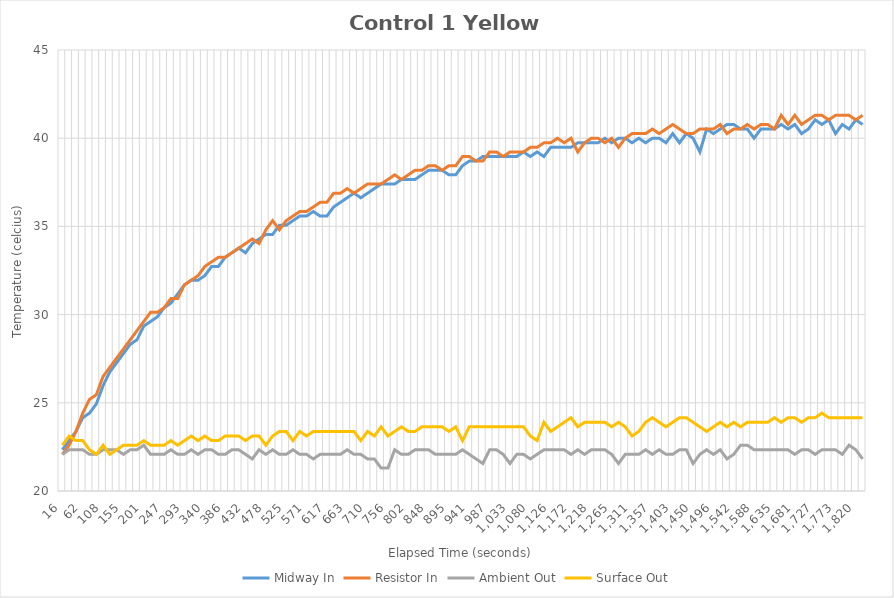
| Category | Midway In | Resistor In | Ambient Out | Surface Out |
|---|---|---|---|---|
| 15.82 | 22.338 | 22.078 | 22.078 | 22.597 |
| 31.24 | 22.857 | 22.597 | 22.338 | 23.117 |
| 46.66 | 23.377 | 23.377 | 22.338 | 22.857 |
| 62.08 | 24.156 | 24.416 | 22.338 | 22.857 |
| 77.5 | 24.416 | 25.195 | 22.078 | 22.338 |
| 92.92 | 24.935 | 25.454 | 22.078 | 22.078 |
| 108.34 | 25.974 | 26.494 | 22.338 | 22.597 |
| 123.76 | 26.753 | 27.013 | 22.338 | 22.078 |
| 139.18 | 27.273 | 27.532 | 22.338 | 22.338 |
| 154.6 | 27.792 | 28.052 | 22.078 | 22.597 |
| 170.02 | 28.312 | 28.571 | 22.338 | 22.597 |
| 185.44 | 28.571 | 29.091 | 22.338 | 22.597 |
| 200.86 | 29.351 | 29.61 | 22.597 | 22.857 |
| 216.28 | 29.61 | 30.13 | 22.078 | 22.597 |
| 231.7 | 29.87 | 30.13 | 22.078 | 22.597 |
| 247.12 | 30.39 | 30.39 | 22.078 | 22.597 |
| 262.54 | 30.649 | 30.909 | 22.338 | 22.857 |
| 277.96 | 31.169 | 30.909 | 22.078 | 22.597 |
| 293.38 | 31.688 | 31.688 | 22.078 | 22.857 |
| 308.8 | 31.948 | 31.948 | 22.338 | 23.117 |
| 324.22 | 31.948 | 32.208 | 22.078 | 22.857 |
| 339.64 | 32.208 | 32.727 | 22.338 | 23.117 |
| 355.05 | 32.727 | 32.987 | 22.338 | 22.857 |
| 370.46 | 32.727 | 33.247 | 22.078 | 22.857 |
| 385.88 | 33.247 | 33.247 | 22.078 | 23.117 |
| 401.3 | 33.506 | 33.506 | 22.338 | 23.117 |
| 416.71 | 33.766 | 33.766 | 22.338 | 23.117 |
| 432.13 | 33.506 | 34.026 | 22.078 | 22.857 |
| 447.55 | 34.026 | 34.286 | 21.818 | 23.117 |
| 462.97 | 34.286 | 34.026 | 22.338 | 23.117 |
| 478.39 | 34.546 | 34.805 | 22.078 | 22.597 |
| 493.8 | 34.546 | 35.325 | 22.338 | 23.117 |
| 509.22 | 35.065 | 34.805 | 22.078 | 23.377 |
| 524.64 | 35.065 | 35.325 | 22.078 | 23.377 |
| 540.06 | 35.325 | 35.584 | 22.338 | 22.857 |
| 555.48 | 35.584 | 35.844 | 22.078 | 23.377 |
| 570.9 | 35.584 | 35.844 | 22.078 | 23.117 |
| 586.32 | 35.844 | 36.104 | 21.818 | 23.377 |
| 601.74 | 35.584 | 36.364 | 22.078 | 23.377 |
| 617.16 | 35.584 | 36.364 | 22.078 | 23.377 |
| 632.58 | 36.104 | 36.883 | 22.078 | 23.377 |
| 648.0 | 36.364 | 36.883 | 22.078 | 23.377 |
| 663.42 | 36.623 | 37.143 | 22.338 | 23.377 |
| 678.84 | 36.883 | 36.883 | 22.078 | 23.377 |
| 694.25 | 36.623 | 37.143 | 22.078 | 22.857 |
| 709.67 | 36.883 | 37.403 | 21.818 | 23.377 |
| 725.08 | 37.143 | 37.403 | 21.818 | 23.117 |
| 740.5 | 37.403 | 37.403 | 21.299 | 23.636 |
| 755.91 | 37.403 | 37.662 | 21.299 | 23.117 |
| 771.33 | 37.403 | 37.922 | 22.338 | 23.377 |
| 786.75 | 37.662 | 37.662 | 22.078 | 23.636 |
| 802.17 | 37.662 | 37.922 | 22.078 | 23.377 |
| 817.58 | 37.662 | 38.182 | 22.338 | 23.377 |
| 833.0 | 37.922 | 38.182 | 22.338 | 23.636 |
| 848.42 | 38.182 | 38.442 | 22.338 | 23.636 |
| 863.84 | 38.182 | 38.442 | 22.078 | 23.636 |
| 879.26 | 38.182 | 38.182 | 22.078 | 23.636 |
| 894.67 | 37.922 | 38.442 | 22.078 | 23.377 |
| 910.09 | 37.922 | 38.442 | 22.078 | 23.636 |
| 925.5 | 38.442 | 38.961 | 22.338 | 22.857 |
| 940.91 | 38.701 | 38.961 | 22.078 | 23.636 |
| 956.32 | 38.701 | 38.701 | 21.818 | 23.636 |
| 971.74 | 38.961 | 38.701 | 21.558 | 23.636 |
| 987.16 | 38.961 | 39.221 | 22.338 | 23.636 |
| 1002.58 | 38.961 | 39.221 | 22.338 | 23.636 |
| 1017.99 | 38.961 | 38.961 | 22.078 | 23.636 |
| 1033.4 | 38.961 | 39.221 | 21.558 | 23.636 |
| 1048.81 | 38.961 | 39.221 | 22.078 | 23.636 |
| 1064.23 | 39.221 | 39.221 | 22.078 | 23.636 |
| 1079.65 | 38.961 | 39.48 | 21.818 | 23.117 |
| 1095.07 | 39.221 | 39.48 | 22.078 | 22.857 |
| 1110.48 | 38.961 | 39.74 | 22.338 | 23.896 |
| 1125.9 | 39.48 | 39.74 | 22.338 | 23.377 |
| 1141.32 | 39.48 | 40 | 22.338 | 23.636 |
| 1156.73 | 39.48 | 39.74 | 22.338 | 23.896 |
| 1172.14 | 39.48 | 40 | 22.078 | 24.156 |
| 1187.56 | 39.74 | 39.221 | 22.338 | 23.636 |
| 1202.98 | 39.74 | 39.74 | 22.078 | 23.896 |
| 1218.39 | 39.74 | 40 | 22.338 | 23.896 |
| 1233.81 | 39.74 | 40 | 22.338 | 23.896 |
| 1249.23 | 40 | 39.74 | 22.338 | 23.896 |
| 1264.65 | 39.74 | 40 | 22.078 | 23.636 |
| 1280.07 | 40 | 39.48 | 21.558 | 23.896 |
| 1295.49 | 40 | 40 | 22.078 | 23.636 |
| 1310.91 | 39.74 | 40.26 | 22.078 | 23.117 |
| 1326.33 | 40 | 40.26 | 22.078 | 23.377 |
| 1341.75 | 39.74 | 40.26 | 22.338 | 23.896 |
| 1357.17 | 40 | 40.52 | 22.078 | 24.156 |
| 1372.58 | 40 | 40.26 | 22.338 | 23.896 |
| 1387.99 | 39.74 | 40.52 | 22.078 | 23.636 |
| 1403.41 | 40.26 | 40.779 | 22.078 | 23.896 |
| 1418.83 | 39.74 | 40.52 | 22.338 | 24.156 |
| 1434.25 | 40.26 | 40.26 | 22.338 | 24.156 |
| 1449.66 | 40 | 40.26 | 21.558 | 23.896 |
| 1465.07 | 39.221 | 40.52 | 22.078 | 23.636 |
| 1480.49 | 40.52 | 40.52 | 22.338 | 23.377 |
| 1495.9 | 40.26 | 40.52 | 22.078 | 23.636 |
| 1511.32 | 40.52 | 40.779 | 22.338 | 23.896 |
| 1526.74 | 40.779 | 40.26 | 21.818 | 23.636 |
| 1542.16 | 40.779 | 40.52 | 22.078 | 23.896 |
| 1557.57 | 40.52 | 40.52 | 22.597 | 23.636 |
| 1572.98 | 40.52 | 40.779 | 22.597 | 23.896 |
| 1588.39 | 40 | 40.52 | 22.338 | 23.896 |
| 1603.79 | 40.52 | 40.779 | 22.338 | 23.896 |
| 1619.21 | 40.52 | 40.779 | 22.338 | 23.896 |
| 1634.63 | 40.52 | 40.52 | 22.338 | 24.156 |
| 1650.05 | 40.779 | 41.299 | 22.338 | 23.896 |
| 1665.47 | 40.52 | 40.779 | 22.338 | 24.156 |
| 1680.89 | 40.779 | 41.299 | 22.078 | 24.156 |
| 1696.3 | 40.26 | 40.779 | 22.338 | 23.896 |
| 1711.72 | 40.52 | 41.039 | 22.338 | 24.156 |
| 1727.14 | 41.039 | 41.299 | 22.078 | 24.156 |
| 1742.55 | 40.779 | 41.299 | 22.338 | 24.416 |
| 1757.96 | 41.039 | 41.039 | 22.338 | 24.156 |
| 1773.38 | 40.26 | 41.299 | 22.338 | 24.156 |
| 1788.8 | 40.779 | 41.299 | 22.078 | 24.156 |
| 1804.22 | 40.52 | 41.299 | 22.597 | 24.156 |
| 1819.63 | 41.039 | 41.039 | 22.338 | 24.156 |
| 1835.05 | 40.779 | 41.299 | 21.818 | 24.156 |